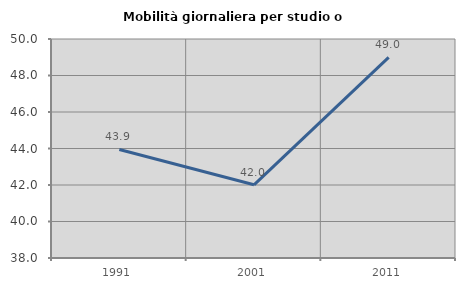
| Category | Mobilità giornaliera per studio o lavoro |
|---|---|
| 1991.0 | 43.947 |
| 2001.0 | 42.01 |
| 2011.0 | 48.99 |